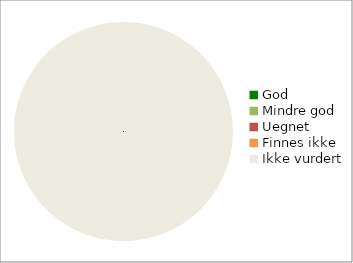
| Category | Series 0 |
|---|---|
| God | 0 |
| Mindre god | 0 |
| Uegnet | 0 |
| Finnes ikke | 0 |
| Ikke vurdert | 144 |